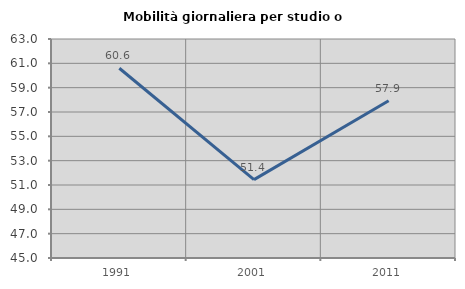
| Category | Mobilità giornaliera per studio o lavoro |
|---|---|
| 1991.0 | 60.596 |
| 2001.0 | 51.445 |
| 2011.0 | 57.928 |